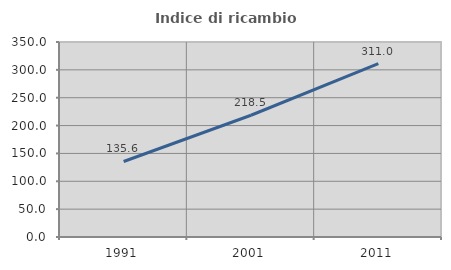
| Category | Indice di ricambio occupazionale  |
|---|---|
| 1991.0 | 135.563 |
| 2001.0 | 218.548 |
| 2011.0 | 311.049 |